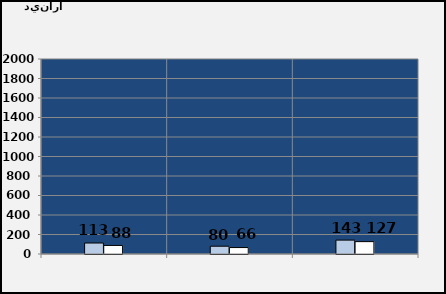
| Category | رقم المعاملات الإجمالي | رقم معاملات التصدير م.د |
|---|---|---|
|  | 112.645 | 87.799 |
|  | 79.928 | 66.155 |
|  | 142.54 | 126.807 |